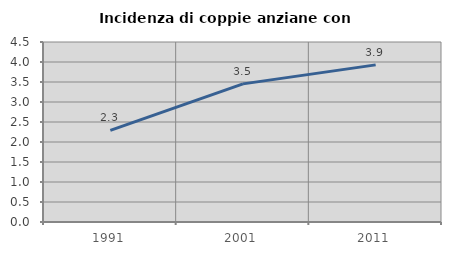
| Category | Incidenza di coppie anziane con figli |
|---|---|
| 1991.0 | 2.29 |
| 2001.0 | 3.453 |
| 2011.0 | 3.928 |